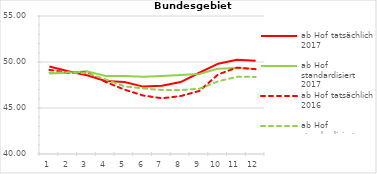
| Category | ab Hof tatsächlich 2017 | ab Hof standardisiert 2017 | ab Hof tatsächlich 2016 | ab Hof standardisiert 2016 |
|---|---|---|---|---|
| 0 | 49.512 | 48.751 | 49.149 | 48.854 |
| 1 | 48.986 | 48.823 | 48.84 | 48.873 |
| 2 | 48.566 | 49.001 | 48.848 | 48.781 |
| 3 | 47.938 | 48.489 | 47.834 | 48.108 |
| 4 | 47.824 | 48.478 | 47.002 | 47.356 |
| 5 | 47.325 | 48.397 | 46.359 | 47.126 |
| 6 | 47.412 | 48.482 | 46.06 | 46.96 |
| 7 | 47.818 | 48.578 | 46.297 | 46.949 |
| 8 | 48.83 | 48.688 | 46.856 | 47.101 |
| 9 | 49.816 | 49.277 | 48.646 | 47.896 |
| 10 | 50.235 | 49.342 | 49.391 | 48.394 |
| 11 | 50.148 | 49.234 | 49.221 | 48.381 |